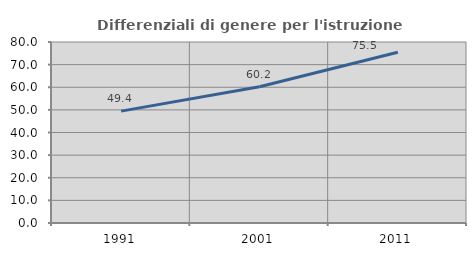
| Category | Differenziali di genere per l'istruzione superiore |
|---|---|
| 1991.0 | 49.438 |
| 2001.0 | 60.219 |
| 2011.0 | 75.471 |